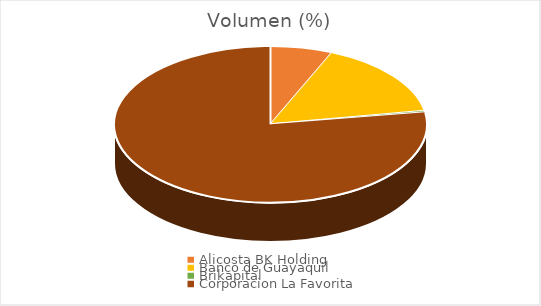
| Category | Volumen |
|---|---|
| Alicosta BK Holding | 20040 |
| Banco de Guayaquil | 49000 |
| Brikapital | 1000 |
| Corporacion La Favorita | 240643.61 |